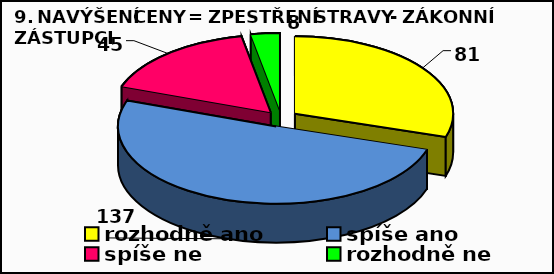
| Category | Series 0 |
|---|---|
| rozhodně ano | 81 |
| spíše ano | 137 |
| spíše ne  | 45 |
| rozhodně ne | 8 |